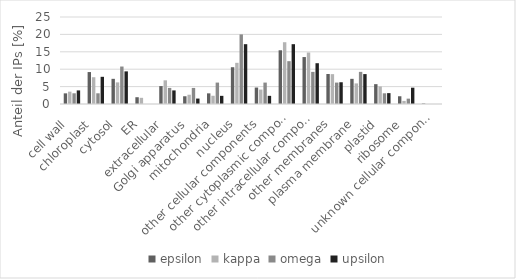
| Category | epsilon | kappa | omega | upsilon |
|---|---|---|---|---|
| cell wall  | 3.06 | 3.55 | 3.077 | 3.906 |
| chloroplast  | 9.179 | 7.692 | 3.077 | 7.812 |
| cytosol  | 7.232 | 6.213 | 10.769 | 9.375 |
| ER  | 1.947 | 1.775 | 0 | 0 |
| extracellular  | 5.146 | 6.805 | 4.615 | 3.906 |
| Golgi apparatus  | 2.225 | 2.663 | 4.615 | 1.562 |
| mitochondria  | 3.06 | 2.367 | 6.154 | 2.344 |
| nucleus  | 10.57 | 11.834 | 20 | 17.188 |
| other cellular components  | 4.729 | 4.142 | 6.154 | 2.344 |
| other cytoplasmic components  | 15.438 | 17.751 | 12.308 | 17.188 |
| other intracellular components  | 13.491 | 14.793 | 9.231 | 11.719 |
| other membranes  | 8.623 | 8.58 | 6.154 | 6.25 |
| plasma membrane  | 7.232 | 5.917 | 9.231 | 8.594 |
| plastid  | 5.702 | 5.03 | 3.077 | 3.125 |
| ribosome  | 2.225 | 0.888 | 1.538 | 4.688 |
| unknown cellular components  | 0.139 | 0 | 0 | 0 |